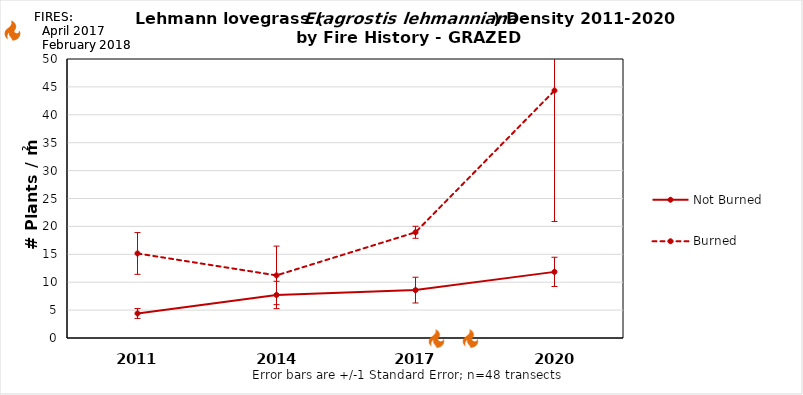
| Category | Not Burned | Burned |
|---|---|---|
| 2011.0 | 4.394 | 15.15 |
| 2014.0 | 7.715 | 11.221 |
| 2017.0 | 8.582 | 18.944 |
| 2020.0 | 11.851 | 44.347 |